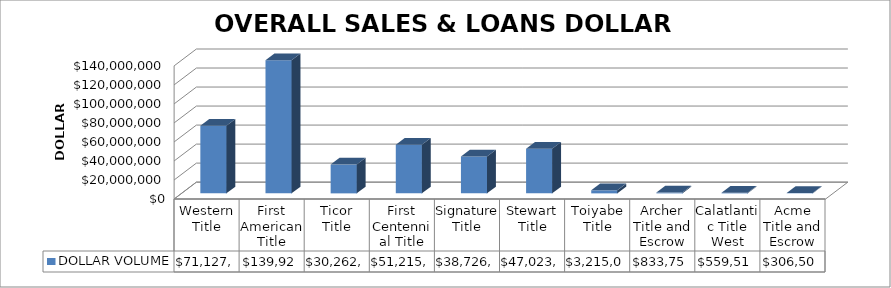
| Category | DOLLAR VOLUME |
|---|---|
| Western Title | 71127742 |
| First American Title | 139922103 |
| Ticor Title | 30262663.04 |
| First Centennial Title | 51215882 |
| Signature Title | 38726528 |
| Stewart Title | 47023546 |
| Toiyabe Title | 3215000 |
| Archer Title and Escrow | 833750 |
| Calatlantic Title West | 559517 |
| Acme Title and Escrow | 306500 |